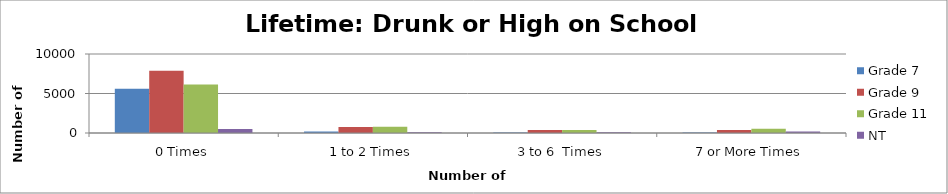
| Category | Grade 7 | Grade 9 | Grade 11 | NT |
|---|---|---|---|---|
| 0 Times | 5598.35 | 7878.36 | 6128.46 | 500.08 |
| 1 to 2 Times | 176.79 | 750.32 | 785.7 | 107.16 |
| 3 to 6  Times | 58.93 | 375.16 | 392.85 | 98.23 |
| 7 or More Times | 58.93 | 375.16 | 549.99 | 187.53 |